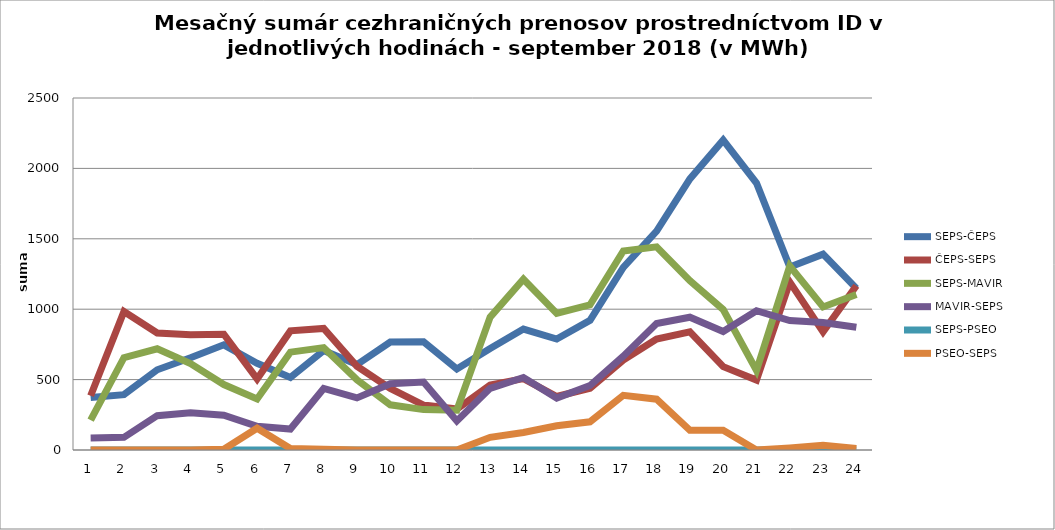
| Category | SEPS-ČEPS | ČEPS-SEPS | SEPS-MAVIR | MAVIR-SEPS | SEPS-PSEO | PSEO-SEPS |
|---|---|---|---|---|---|---|
| 1.0 | 373 | 385 | 212 | 86 | 0 | 0 |
| 2.0 | 393 | 984 | 656 | 90 | 0 | 0 |
| 3.0 | 570 | 831 | 719 | 244 | 0 | 0 |
| 4.0 | 655 | 819 | 614 | 265 | 0 | 0 |
| 5.0 | 747 | 822 | 465 | 247 | 0 | 5 |
| 6.0 | 616 | 505 | 362 | 168 | 0 | 155 |
| 7.0 | 515 | 846 | 695 | 149 | 0 | 10 |
| 8.0 | 707 | 863 | 727 | 437 | 0 | 5 |
| 9.0 | 607 | 595 | 498 | 370 | 0 | 0 |
| 10.0 | 767 | 437 | 321 | 470 | 0 | 0 |
| 11.0 | 769 | 319 | 287 | 483 | 0 | 0 |
| 12.0 | 575 | 291 | 283 | 206 | 0 | 0 |
| 13.0 | 721 | 461 | 944 | 438 | 0 | 90 |
| 14.0 | 859 | 507 | 1213 | 515 | 0 | 124 |
| 15.0 | 788 | 380 | 970 | 369 | 0 | 172 |
| 16.0 | 921 | 439 | 1031 | 458 | 0 | 200 |
| 17.0 | 1297 | 639 | 1414 | 666 | 0 | 388 |
| 18.0 | 1554 | 788 | 1443 | 898 | 0 | 361 |
| 19.0 | 1925 | 840 | 1203 | 943 | 0 | 140 |
| 20.0 | 2201 | 592 | 998 | 841 | 0 | 140 |
| 21.0 | 1896 | 497 | 565 | 989 | 0 | 0 |
| 22.0 | 1299 | 1192 | 1307 | 919 | 0 | 15 |
| 23.0 | 1391 | 839 | 1016 | 906 | 0 | 33 |
| 24.0 | 1148 | 1167 | 1104 | 872 | 0 | 10 |